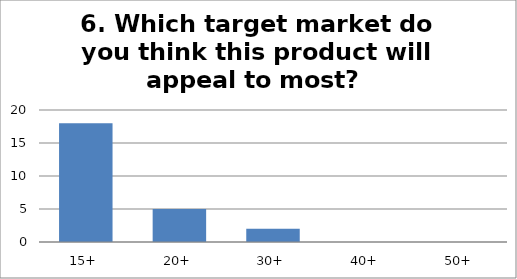
| Category | Series 0 |
|---|---|
| 15+ | 18 |
| 20+ | 5 |
| 30+ | 2 |
| 40+ | 0 |
| 50+ | 0 |